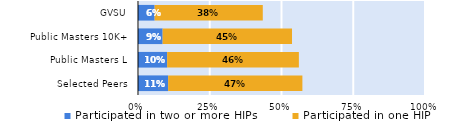
| Category | Participated in two or more HIPs | Participated in one HIP |
|---|---|---|
| Selected Peers | 0.105 | 0.468 |
| Public Masters L | 0.102 | 0.459 |
| Public Masters 10K+ | 0.086 | 0.451 |
| GVSU | 0.058 | 0.377 |